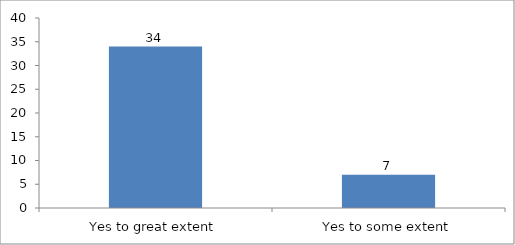
| Category | Do you like the concept of youth-led changemaking?  |
|---|---|
| Yes to great extent | 34 |
| Yes to some extent | 7 |